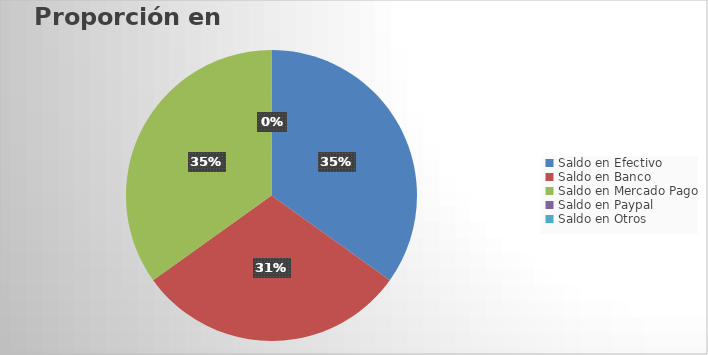
| Category | Series 0 |
|---|---|
| Saldo en Efectivo | 1500 |
| Saldo en Banco | 1300 |
| Saldo en Mercado Pago | 1500 |
| Saldo en Paypal | 0 |
| Saldo en Otros | 0 |